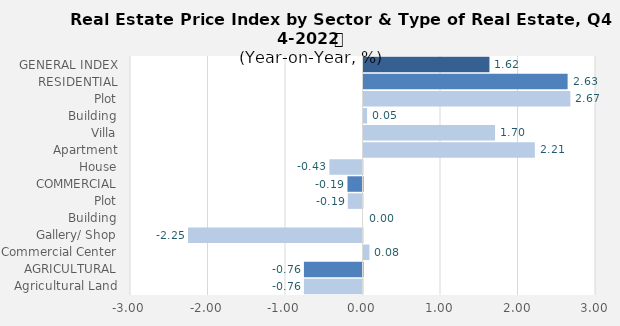
| Category | Q4- 2021 |
|---|---|
| GENERAL INDEX | 1.625 |
| RESIDENTIAL | 2.634 |
| Plot | 2.669 |
| Building | 0.046 |
| Villa | 1.697 |
| Apartment | 2.211 |
| House | -0.427 |
| COMMERCIAL | -0.194 |
| Plot | -0.19 |
| Building | 0 |
| Gallery/ Shop | -2.252 |
| Commercial Center | 0.076 |
| AGRICULTURAL | -0.756 |
| Agricultural Land | -0.756 |